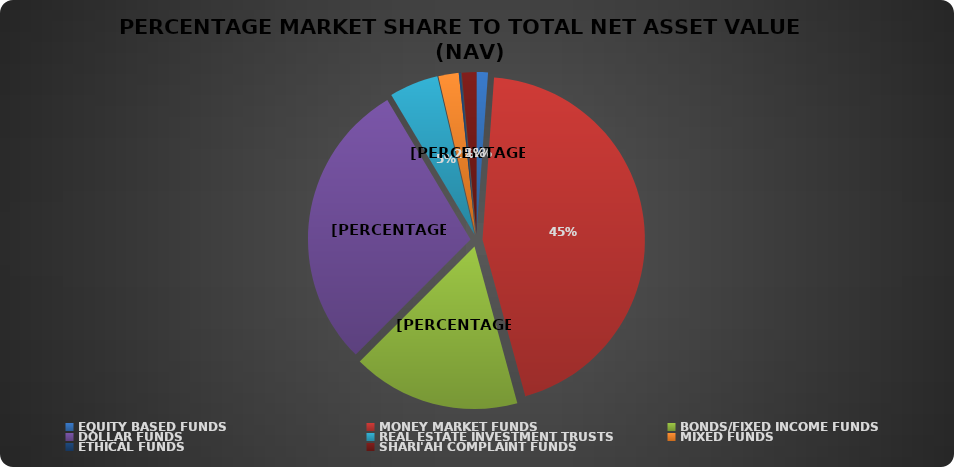
| Category | NET ASSET VALUE |
|---|---|
| EQUITY BASED FUNDS | 21756530204.33 |
| MONEY MARKET FUNDS | 855610980289.17 |
| BONDS/FIXED INCOME FUNDS | 320687160580.932 |
| DOLLAR FUNDS | 555450233256.585 |
| REAL ESTATE INVESTMENT TRUSTS | 93626727218.01 |
| MIXED FUNDS | 38811275853.395 |
| ETHICAL FUNDS | 3802289133.55 |
| SHARI'AH COMPLAINT FUNDS | 27801303893.87 |